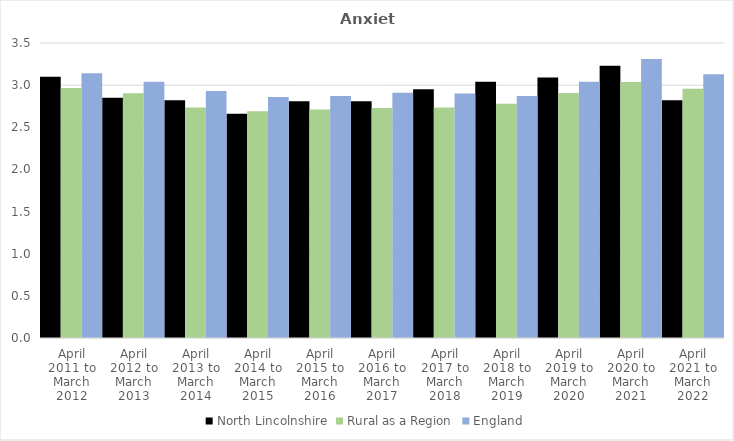
| Category | North Lincolnshire | Rural as a Region | England |
|---|---|---|---|
| April 2011 to March 2012 | 3.1 | 2.967 | 3.14 |
| April 2012 to March 2013 | 2.85 | 2.904 | 3.04 |
| April 2013 to March 2014 | 2.82 | 2.734 | 2.93 |
| April 2014 to March 2015 | 2.66 | 2.691 | 2.86 |
| April 2015 to March 2016 | 2.81 | 2.711 | 2.87 |
| April 2016 to March 2017 | 2.81 | 2.729 | 2.91 |
| April 2017 to March 2018 | 2.95 | 2.736 | 2.9 |
| April 2018 to March 2019 | 3.04 | 2.78 | 2.87 |
| April 2019 to March 2020 | 3.09 | 2.908 | 3.04 |
| April 2020 to March 2021 | 3.23 | 3.036 | 3.31 |
| April 2021 to March 2022 | 2.82 | 2.956 | 3.13 |